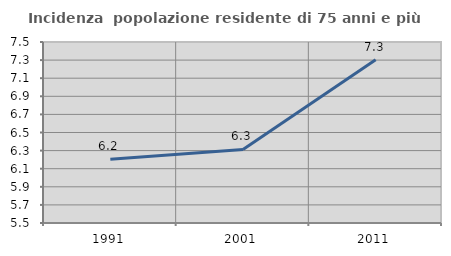
| Category | Incidenza  popolazione residente di 75 anni e più |
|---|---|
| 1991.0 | 6.205 |
| 2001.0 | 6.313 |
| 2011.0 | 7.303 |